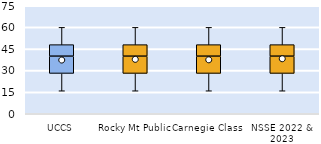
| Category | 25th | 50th | 75th |
|---|---|---|---|
| UCCS | 28 | 12 | 8 |
| Rocky Mt Public | 28 | 12 | 8 |
| Carnegie Class | 28 | 12 | 8 |
| NSSE 2022 & 2023 | 28 | 12 | 8 |